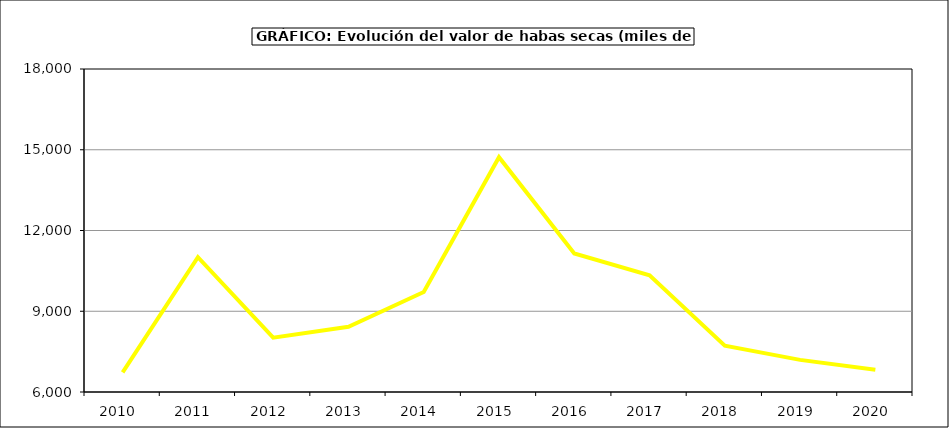
| Category | Valor |
|---|---|
| 2010.0 | 6730.947 |
| 2011.0 | 11007.809 |
| 2012.0 | 8020.102 |
| 2013.0 | 8422.081 |
| 2014.0 | 9715.78 |
| 2015.0 | 14725 |
| 2016.0 | 11148.6 |
| 2017.0 | 10333.378 |
| 2018.0 | 7717.975 |
| 2019.0 | 7193.25 |
| 2020.0 | 6824.697 |